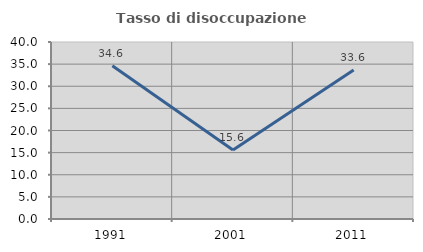
| Category | Tasso di disoccupazione giovanile  |
|---|---|
| 1991.0 | 34.639 |
| 2001.0 | 15.607 |
| 2011.0 | 33.645 |